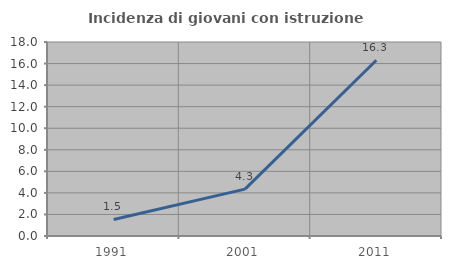
| Category | Incidenza di giovani con istruzione universitaria |
|---|---|
| 1991.0 | 1.538 |
| 2001.0 | 4.348 |
| 2011.0 | 16.304 |